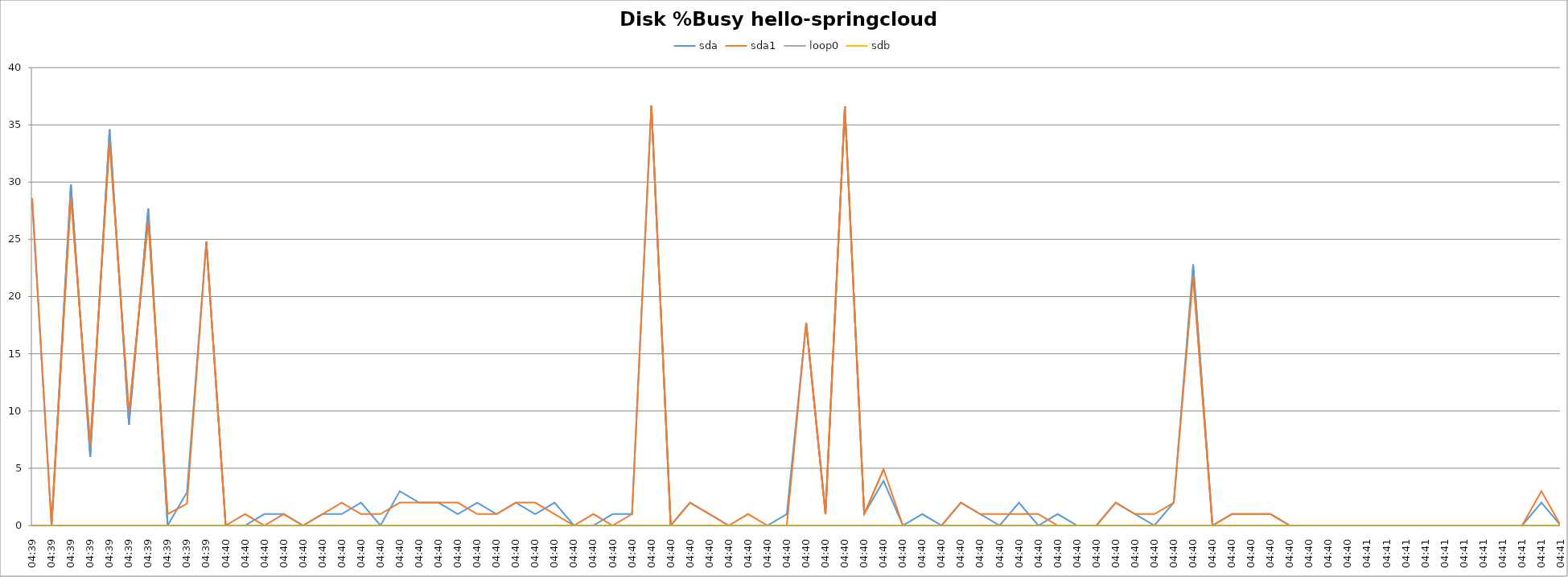
| Category | sda | sda1 | loop0 | sdb |
|---|---|---|---|---|
| 04:39 | 28.3 | 28.6 | 0 | 0 |
| 04:39 | 0 | 0 | 0 | 0 |
| 04:39 | 29.8 | 28.8 | 0 | 0 |
| 04:39 | 6 | 7 | 0 | 0 |
| 04:39 | 34.6 | 33.6 | 0 | 0 |
| 04:39 | 8.8 | 9.8 | 0 | 0 |
| 04:39 | 27.7 | 26.7 | 0 | 0 |
| 04:39 | 0 | 1 | 0 | 0 |
| 04:39 | 2.9 | 1.9 | 0 | 0 |
| 04:39 | 24.8 | 24.8 | 0 | 0 |
| 04:40 | 0 | 0 | 0 | 0 |
| 04:40 | 0 | 1 | 0 | 0 |
| 04:40 | 1 | 0 | 0 | 0 |
| 04:40 | 1 | 1 | 0 | 0 |
| 04:40 | 0 | 0 | 0 | 0 |
| 04:40 | 1 | 1 | 0 | 0 |
| 04:40 | 1 | 2 | 0 | 0 |
| 04:40 | 2 | 1 | 0 | 0 |
| 04:40 | 0 | 1 | 0 | 0 |
| 04:40 | 3 | 2 | 0 | 0 |
| 04:40 | 2 | 2 | 0 | 0 |
| 04:40 | 2 | 2 | 0 | 0 |
| 04:40 | 1 | 2 | 0 | 0 |
| 04:40 | 2 | 1 | 0 | 0 |
| 04:40 | 1 | 1 | 0 | 0 |
| 04:40 | 2 | 2 | 0 | 0 |
| 04:40 | 1 | 2 | 0 | 0 |
| 04:40 | 2 | 1 | 0 | 0 |
| 04:40 | 0 | 0 | 0 | 0 |
| 04:40 | 0 | 1 | 0 | 0 |
| 04:40 | 1 | 0 | 0 | 0 |
| 04:40 | 1 | 1 | 0 | 0 |
| 04:40 | 36.7 | 36.7 | 0 | 0 |
| 04:40 | 0 | 0 | 0 | 0 |
| 04:40 | 2 | 2 | 0 | 0 |
| 04:40 | 1 | 1 | 0 | 0 |
| 04:40 | 0 | 0 | 0 | 0 |
| 04:40 | 0 | 1 | 0 | 0 |
| 04:40 | 0 | 0 | 0 | 0 |
| 04:40 | 1 | 0 | 0 | 0 |
| 04:40 | 17.7 | 17.7 | 0 | 0 |
| 04:40 | 1 | 1 | 0 | 0 |
| 04:40 | 36.6 | 36.6 | 0 | 0 |
| 04:40 | 1 | 1 | 0 | 0 |
| 04:40 | 3.9 | 4.9 | 0 | 0 |
| 04:40 | 0 | 0 | 0 | 0 |
| 04:40 | 1 | 0 | 0 | 0 |
| 04:40 | 0 | 0 | 0 | 0 |
| 04:40 | 2 | 2 | 0 | 0 |
| 04:40 | 1 | 1 | 0 | 0 |
| 04:40 | 0 | 1 | 0 | 0 |
| 04:40 | 2 | 1 | 0 | 0 |
| 04:40 | 0 | 1 | 0 | 0 |
| 04:40 | 1 | 0 | 0 | 0 |
| 04:40 | 0 | 0 | 0 | 0 |
| 04:40 | 0 | 0 | 0 | 0 |
| 04:40 | 2 | 2 | 0 | 0 |
| 04:40 | 1 | 1 | 0 | 0 |
| 04:40 | 0 | 1 | 0 | 0 |
| 04:40 | 2 | 2 | 0 | 0 |
| 04:40 | 22.8 | 21.8 | 0 | 0 |
| 04:40 | 0 | 0 | 0 | 0 |
| 04:40 | 1 | 1 | 0 | 0 |
| 04:40 | 1 | 1 | 0 | 0 |
| 04:40 | 1 | 1 | 0 | 0 |
| 04:40 | 0 | 0 | 0 | 0 |
| 04:40 | 0 | 0 | 0 | 0 |
| 04:40 | 0 | 0 | 0 | 0 |
| 04:40 | 0 | 0 | 0 | 0 |
| 04:41 | 0 | 0 | 0 | 0 |
| 04:41 | 0 | 0 | 0 | 0 |
| 04:41 | 0 | 0 | 0 | 0 |
| 04:41 | 0 | 0 | 0 | 0 |
| 04:41 | 0 | 0 | 0 | 0 |
| 04:41 | 0 | 0 | 0 | 0 |
| 04:41 | 0 | 0 | 0 | 0 |
| 04:41 | 0 | 0 | 0 | 0 |
| 04:41 | 0 | 0 | 0 | 0 |
| 04:41 | 2 | 3 | 0 | 0 |
| 04:41 | 0 | 0 | 0 | 0 |